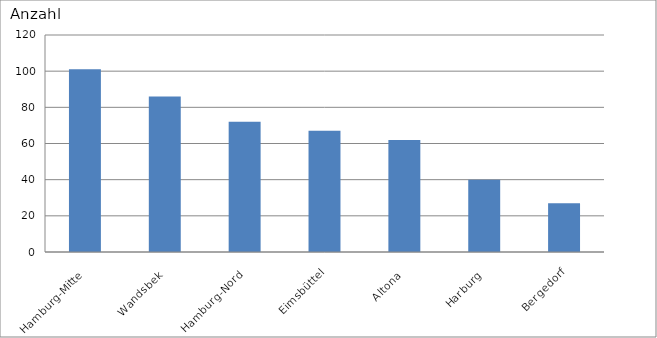
| Category | Hamburg-Mitte Wandsbek Hamburg-Nord Eimsbüttel Altona Harburg Bergedorf |
|---|---|
| Hamburg-Mitte | 101 |
| Wandsbek | 86 |
| Hamburg-Nord | 72 |
| Eimsbüttel | 67 |
| Altona | 62 |
| Harburg | 40 |
| Bergedorf | 27 |